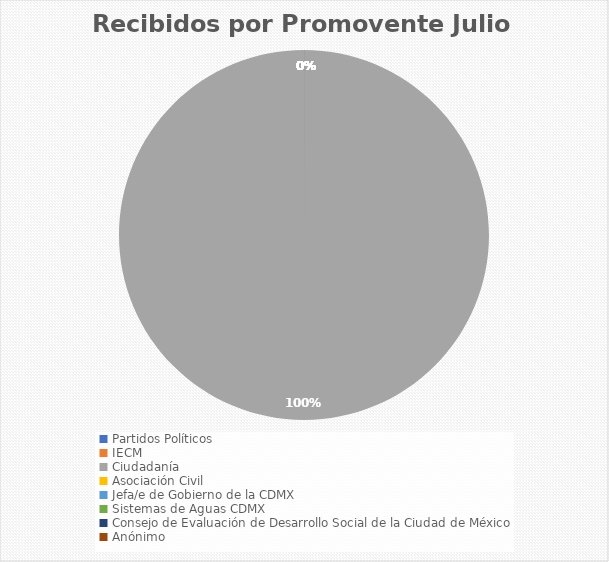
| Category | Recibidos por Promovente Julio |
|---|---|
| Partidos Políticos | 0 |
| IECM | 0 |
| Ciudadanía  | 8 |
| Asociación Civil | 0 |
| Jefa/e de Gobierno de la CDMX | 0 |
| Sistemas de Aguas CDMX | 0 |
| Consejo de Evaluación de Desarrollo Social de la Ciudad de México | 0 |
| Anónimo | 0 |